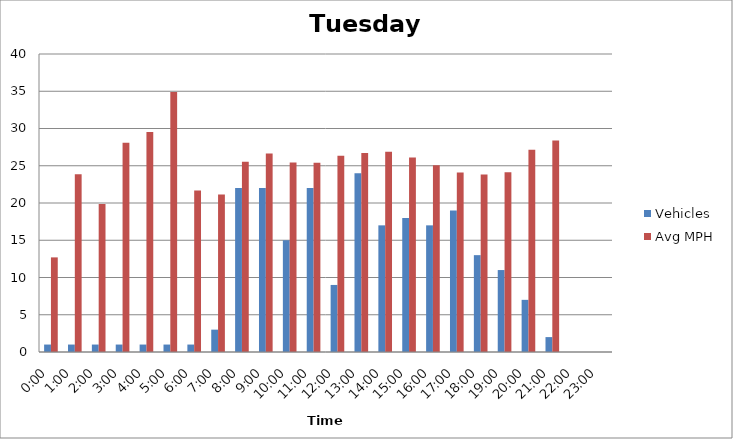
| Category | Vehicles | Avg MPH |
|---|---|---|
| 0:00 | 1 | 12.7 |
| 1:00 | 1 | 23.87 |
| 2:00 | 1 | 19.85 |
| 3:00 | 1 | 28.1 |
| 4:00 | 1 | 29.53 |
| 5:00 | 1 | 34.91 |
| 6:00 | 1 | 21.69 |
| 7:00 | 3 | 21.13 |
| 8:00 | 22 | 25.54 |
| 9:00 | 22 | 26.64 |
| 10:00 | 15 | 25.44 |
| 11:00 | 22 | 25.4 |
| 12:00 | 9 | 26.34 |
| 13:00 | 24 | 26.7 |
| 14:00 | 17 | 26.87 |
| 15:00 | 18 | 26.1 |
| 16:00 | 17 | 25.08 |
| 17:00 | 19 | 24.11 |
| 18:00 | 13 | 23.84 |
| 19:00 | 11 | 24.12 |
| 20:00 | 7 | 27.14 |
| 21:00 | 2 | 28.39 |
| 22:00 | 0 | 0 |
| 23:00 | 0 | 0 |